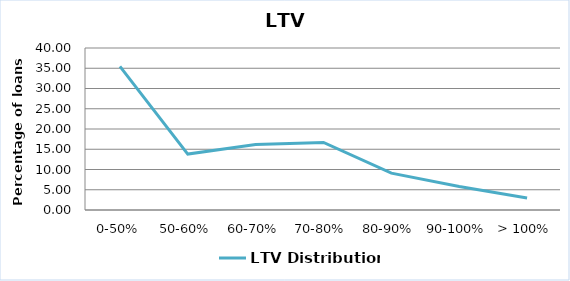
| Category | LTV Distribution |
|---|---|
| 0-50% | 35.444 |
| 50-60% | 13.804 |
| 60-70% | 16.164 |
| 70-80% | 16.691 |
| 80-90% | 9.108 |
| 90-100% | 5.808 |
| > 100% | 2.981 |